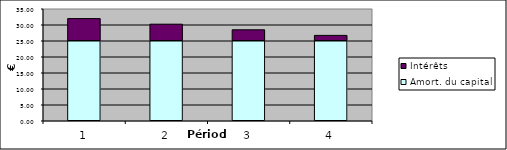
| Category | Amort. du capital | Intérêts |
|---|---|---|
| 0 | 25 | 7 |
| 1 | 25 | 5.25 |
| 2 | 25 | 3.5 |
| 3 | 25 | 1.75 |